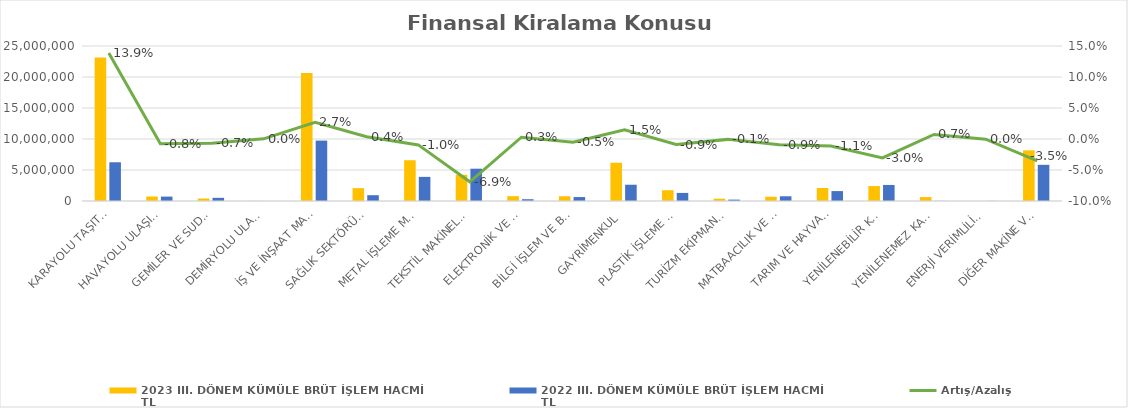
| Category | 2023 III. DÖNEM KÜMÜLE BRÜT İŞLEM HACMİ 
TL | 2022 III. DÖNEM KÜMÜLE BRÜT İŞLEM HACMİ 
TL |
|---|---|---|
| KARAYOLU TAŞITLARI | 23128425.404 | 6249692.014 |
| HAVAYOLU ULAŞIM ARAÇLARI | 721899.879 | 710489 |
| GEMİLER VE SUDA YÜZEN TAŞIT VE ARAÇLAR | 396097.765 | 511733.318 |
| DEMİRYOLU ULAŞIM ARAÇLARI | 29171 | 3944 |
| İŞ VE İNŞAAT MAKİNELERİ | 20626636.412 | 9741021.203 |
| SAĞLIK SEKTÖRÜ VE ESTETİK EKİPMANLARI | 2070853.593 | 935328.65 |
| METAL İŞLEME MAKİNELERİ | 6579706.499 | 3889618.72 |
| TEKSTİL MAKİNELERİ | 4224533.329 | 5210920.283 |
| ELEKTRONİK VE OPTİK CİHAZLAR | 782014.574 | 287703.771 |
| BİLGİ İŞLEM VE BÜRO SİSTEMLERİ | 763751.729 | 635054.48 |
| GAYRİMENKUL | 6169973.624 | 2624353.991 |
| PLASTİK İŞLEME MAKİNELERİ | 1739465.303 | 1303954.526 |
| TURİZM EKİPMANLARI | 369691.428 | 222090.276 |
| MATBAACILIK VE KAĞIT İŞLEME MAKİNELERİ | 683410.678 | 761664.165 |
| TARIM VE HAYVANCILIK MAKİNELERİ | 2092392.359 | 1598284.433 |
| YENİLENEBİLİR KAYNAKLI ELEKTRİK ENERJİSİ ÜRETİM EKİPMANLARI | 2410574.918 | 2587958.204 |
| YENİLENEMEZ KAYNAKLI ELEKTRİK ENERJİSİ ÜRETİM EKİPMANLARI | 632020 | 16340.788 |
| ENERJİ VERİMLİLİĞİ EKİPMANLARI | 0 | 15111.342 |
| DİĞER MAKİNE VE EKİPMANLAR | 8167694.66 | 5836067.32 |